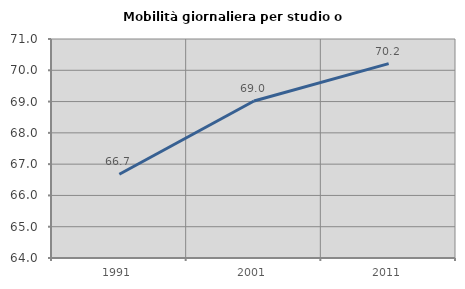
| Category | Mobilità giornaliera per studio o lavoro |
|---|---|
| 1991.0 | 66.676 |
| 2001.0 | 69.017 |
| 2011.0 | 70.212 |